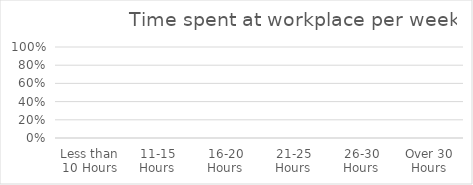
| Category | Series 0 |
|---|---|
| Less than 10 Hours | 0 |
| 11-15 Hours | 0 |
| 16-20 Hours | 0 |
| 21-25 Hours | 0 |
| 26-30 Hours | 0 |
| Over 30 Hours | 0 |